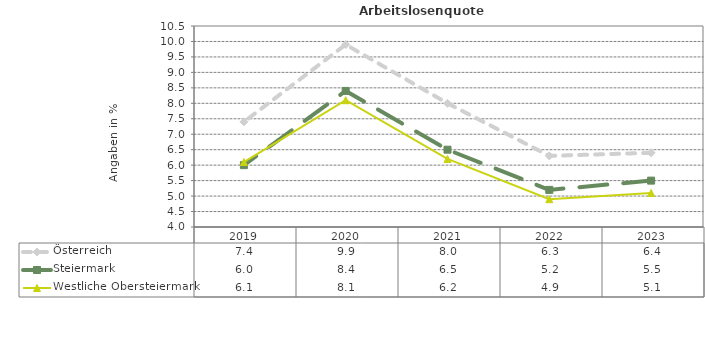
| Category | Österreich | Steiermark | Westliche Obersteiermark |
|---|---|---|---|
| 2023.0 | 6.4 | 5.5 | 5.1 |
| 2022.0 | 6.3 | 5.2 | 4.9 |
| 2021.0 | 8 | 6.5 | 6.2 |
| 2020.0 | 9.9 | 8.4 | 8.1 |
| 2019.0 | 7.4 | 6 | 6.1 |